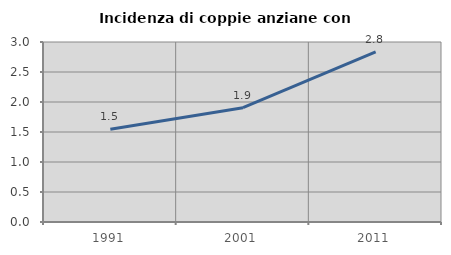
| Category | Incidenza di coppie anziane con figli |
|---|---|
| 1991.0 | 1.546 |
| 2001.0 | 1.905 |
| 2011.0 | 2.836 |